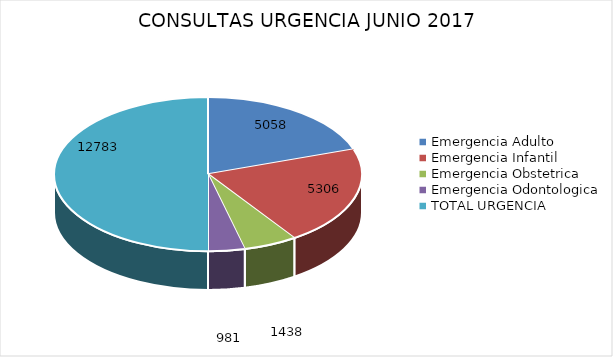
| Category | CONSULTAS |
|---|---|
| Emergencia Adulto | 5058 |
| Emergencia Infantil | 5306 |
| Emergencia Obstetrica | 1438 |
| Emergencia Odontologica | 981 |
| TOTAL URGENCIA | 12783 |